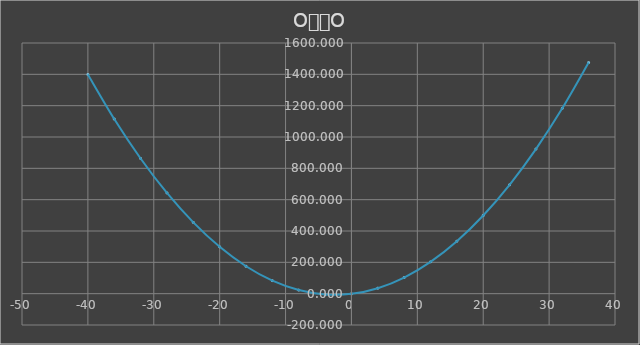
| Category | Series 0 |
|---|---|
| -40.0 | 1399 |
| -36.0 | 1115 |
| -32.0 | 863 |
| -28.0 | 643 |
| -24.0 | 455 |
| -20.0 | 299 |
| -16.0 | 175 |
| -12.0 | 83 |
| -8.0 | 23 |
| -4.0 | -5 |
| 0.0 | -1 |
| 4.0 | 35 |
| 8.0 | 103 |
| 12.0 | 203 |
| 16.0 | 335 |
| 20.0 | 499 |
| 24.0 | 695 |
| 28.0 | 923 |
| 32.0 | 1183 |
| 36.0 | 1475 |